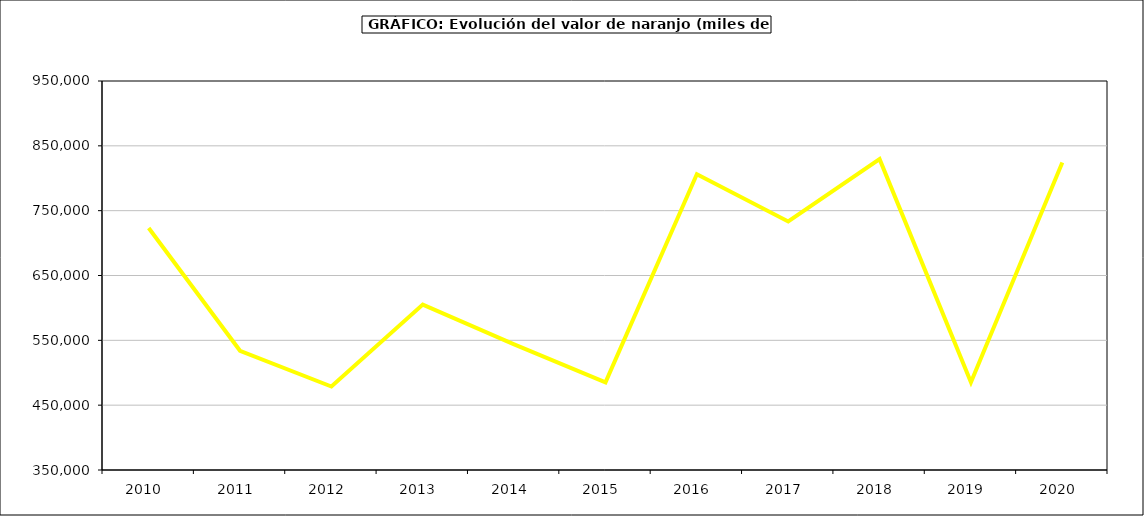
| Category | Valor |
|---|---|
| 2010.0 | 723258.418 |
| 2011.0 | 533897.387 |
| 2012.0 | 478708.956 |
| 2013.0 | 605137.07 |
| 2014.0 | 543774.818 |
| 2015.0 | 485218 |
| 2016.0 | 806164 |
| 2017.0 | 733433.06 |
| 2018.0 | 829436.538 |
| 2019.0 | 485336.808 |
| 2020.0 | 824162.074 |